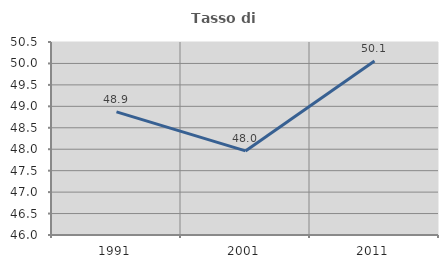
| Category | Tasso di occupazione   |
|---|---|
| 1991.0 | 48.87 |
| 2001.0 | 47.96 |
| 2011.0 | 50.058 |